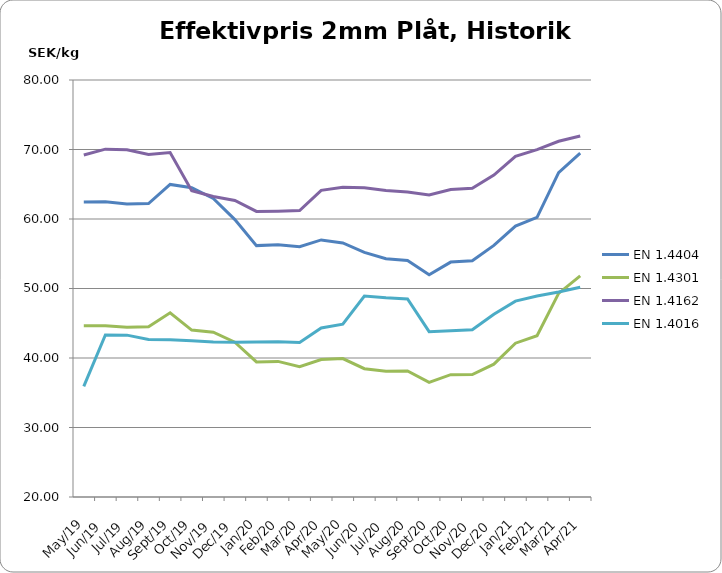
| Category | EN 1.4404 | EN 1.4301 | EN 1.4162  | EN 1.4016 |
|---|---|---|---|---|
| 2019-05-01 | 62.45 | 44.64 | 69.21 | 35.91 |
| 2019-06-01 | 62.47 | 44.64 | 70.05 | 43.31 |
| 2019-07-01 | 62.16 | 44.44 | 69.96 | 43.29 |
| 2019-08-01 | 62.22 | 44.5 | 69.28 | 42.65 |
| 2019-09-01 | 64.97 | 46.5 | 69.57 | 42.62 |
| 2019-10-01 | 64.51 | 44.02 | 64.06 | 42.48 |
| 2019-11-01 | 62.95 | 43.71 | 63.23 | 42.31 |
| 2019-12-01 | 59.92 | 42.28 | 62.66 | 42.27 |
| 2020-01-01 | 56.17 | 39.44 | 61.09 | 42.3 |
| 2020-02-01 | 56.29 | 39.51 | 61.13 | 42.35 |
| 2020-03-01 | 56.011 | 38.762 | 61.207 | 42.238 |
| 2020-04-01 | 56.99 | 39.78 | 64.12 | 44.32 |
| 2020-05-01 | 56.561 | 39.922 | 64.555 | 44.865 |
| 2020-06-01 | 55.205 | 38.457 | 64.504 | 48.924 |
| 2020-07-01 | 54.28 | 38.09 | 64.1 | 48.67 |
| 2020-08-01 | 54.032 | 38.136 | 63.889 | 48.499 |
| 2020-09-01 | 51.982 | 36.492 | 63.459 | 43.787 |
| 2020-10-01 | 53.8 | 37.597 | 64.242 | 43.938 |
| 2020-11-01 | 53.982 | 37.627 | 64.412 | 44.061 |
| 2020-12-01 | 56.202 | 39.117 | 66.315 | 46.295 |
| 2021-01-01 | 58.983 | 42.129 | 69.024 | 48.184 |
| 2021-02-01 | 60.225 | 43.204 | 69.988 | 48.927 |
| 2021-03-01 | 66.669 | 49.29 | 71.179 | 49.506 |
| 2021-04-01 | 69.492 | 51.816 | 71.943 | 50.186 |